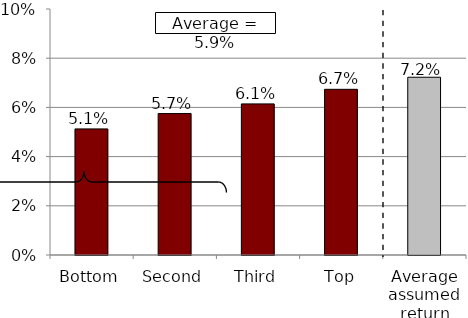
| Category | Quartiles |
|---|---|
| Bottom | 0.051 |
| Second | 0.057 |
| Third | 0.061 |
| Top | 0.067 |
| Average assumed return | 0.072 |